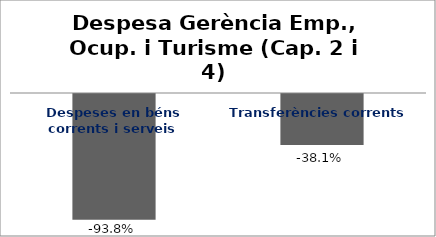
| Category | Series 0 |
|---|---|
| Despeses en béns corrents i serveis | -0.938 |
| Transferències corrents | -0.381 |